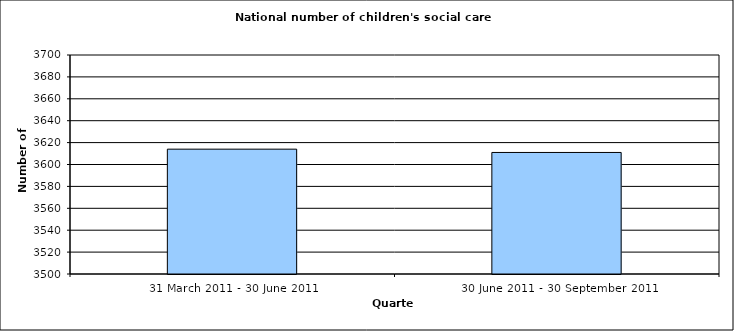
| Category | Series 0 |
|---|---|
| 31 March 2011 - 30 June 2011 | 3614 |
| 30 June 2011 - 30 September 2011 | 3611 |